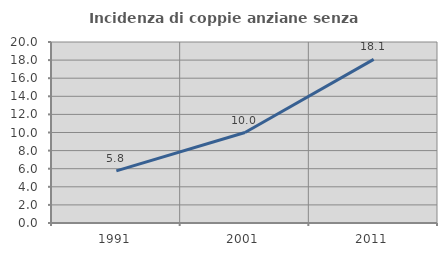
| Category | Incidenza di coppie anziane senza figli  |
|---|---|
| 1991.0 | 5.759 |
| 2001.0 | 10 |
| 2011.0 | 18.078 |